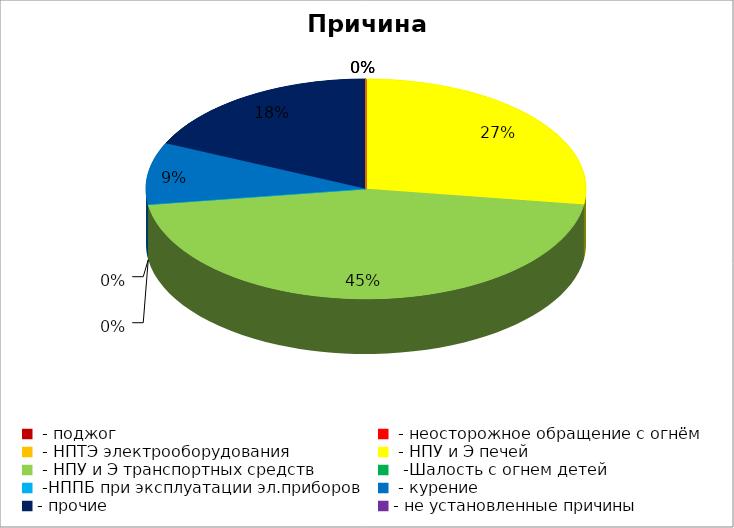
| Category | Причина пожара |
|---|---|
|  - поджог | 0 |
|  - неосторожное обращение с огнём | 0 |
|  - НПТЭ электрооборудования | 0 |
|  - НПУ и Э печей | 3 |
|  - НПУ и Э транспортных средств | 5 |
|   -Шалость с огнем детей | 0 |
|  -НППБ при эксплуатации эл.приборов | 0 |
|  - курение | 1 |
| - прочие | 2 |
| - не установленные причины | 0 |